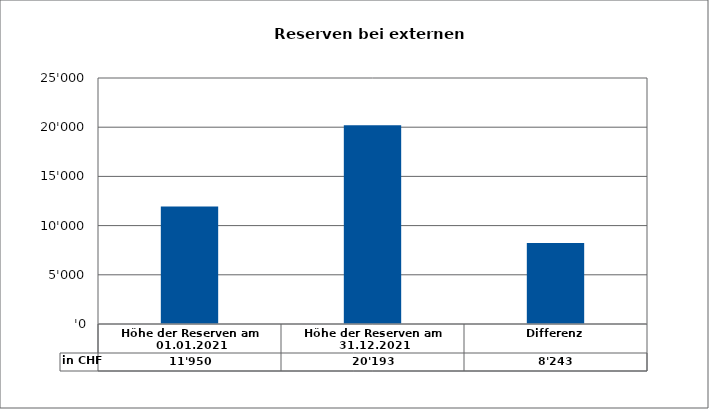
| Category | in CHF |
|---|---|
| Höhe der Reserven am 01.01.2021 | 11950 |
| Höhe der Reserven am 31.12.2021 | 20193 |
| Differenz | 8243 |